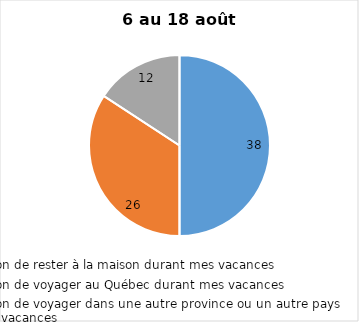
| Category | Series 0 |
|---|---|
| J’ai l’intention de rester à la maison durant mes vacances | 38 |
| J’ai l’intention de voyager au Québec durant mes vacances | 26 |
| J’ai l’intention de voyager dans une autre province ou un autre pays durant mes vacances | 12 |